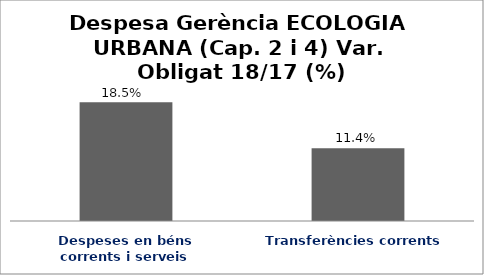
| Category | Series 0 |
|---|---|
| Despeses en béns corrents i serveis | 0.185 |
| Transferències corrents | 0.114 |